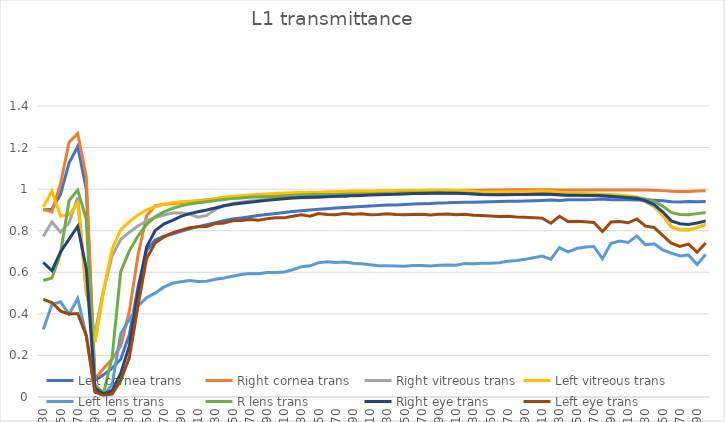
| Category | Left cornea trans | Right cornea trans | Right vitreous trans | Left vitreous trans | Left lens trans | R lens trans | Right eye trans | Left eye trans |
|---|---|---|---|---|---|---|---|---|
| 230.0 | 0.9 | 0.904 | 0.773 | 0.916 | 0.324 | 0.56 | 0.647 | 0.47 |
| 240.0 | 0.903 | 0.891 | 0.842 | 0.989 | 0.444 | 0.573 | 0.608 | 0.454 |
| 250.0 | 0.975 | 1.025 | 0.793 | 0.871 | 0.458 | 0.69 | 0.698 | 0.413 |
| 260.0 | 1.127 | 1.226 | 0.839 | 0.877 | 0.399 | 0.945 | 0.76 | 0.4 |
| 270.0 | 1.205 | 1.268 | 0.961 | 0.932 | 0.474 | 0.995 | 0.822 | 0.402 |
| 280.0 | 0.998 | 1.059 | 0.506 | 0.518 | 0.295 | 0.854 | 0.618 | 0.295 |
| 290.0 | 0.081 | 0.085 | 0.301 | 0.263 | 0.024 | 0.059 | 0.043 | 0.024 |
| 300.0 | 0.106 | 0.137 | 0.512 | 0.509 | 0.008 | 0.019 | 0.015 | 0.008 |
| 310.0 | 0.139 | 0.182 | 0.679 | 0.713 | 0.06 | 0.19 | 0.03 | 0.014 |
| 320.0 | 0.181 | 0.245 | 0.758 | 0.804 | 0.304 | 0.603 | 0.113 | 0.079 |
| 330.0 | 0.3 | 0.411 | 0.793 | 0.843 | 0.373 | 0.703 | 0.245 | 0.19 |
| 340.0 | 0.528 | 0.679 | 0.823 | 0.876 | 0.437 | 0.775 | 0.503 | 0.437 |
| 350.0 | 0.705 | 0.871 | 0.846 | 0.9 | 0.478 | 0.83 | 0.721 | 0.665 |
| 360.0 | 0.755 | 0.919 | 0.864 | 0.915 | 0.5 | 0.867 | 0.8 | 0.741 |
| 370.0 | 0.773 | 0.928 | 0.876 | 0.927 | 0.528 | 0.891 | 0.832 | 0.769 |
| 380.0 | 0.784 | 0.929 | 0.885 | 0.935 | 0.547 | 0.907 | 0.85 | 0.79 |
| 390.0 | 0.798 | 0.936 | 0.885 | 0.94 | 0.555 | 0.92 | 0.869 | 0.803 |
| 400.0 | 0.81 | 0.941 | 0.879 | 0.941 | 0.56 | 0.928 | 0.882 | 0.815 |
| 410.0 | 0.82 | 0.944 | 0.865 | 0.942 | 0.556 | 0.934 | 0.892 | 0.82 |
| 420.0 | 0.829 | 0.949 | 0.874 | 0.946 | 0.557 | 0.94 | 0.9 | 0.82 |
| 430.0 | 0.839 | 0.954 | 0.902 | 0.954 | 0.566 | 0.945 | 0.909 | 0.834 |
| 440.0 | 0.849 | 0.96 | 0.92 | 0.961 | 0.573 | 0.95 | 0.92 | 0.837 |
| 450.0 | 0.856 | 0.964 | 0.931 | 0.965 | 0.581 | 0.954 | 0.927 | 0.847 |
| 460.0 | 0.862 | 0.967 | 0.937 | 0.969 | 0.589 | 0.957 | 0.932 | 0.849 |
| 470.0 | 0.868 | 0.969 | 0.942 | 0.972 | 0.594 | 0.96 | 0.937 | 0.854 |
| 480.0 | 0.873 | 0.971 | 0.946 | 0.974 | 0.594 | 0.962 | 0.942 | 0.851 |
| 490.0 | 0.878 | 0.973 | 0.951 | 0.977 | 0.599 | 0.963 | 0.946 | 0.858 |
| 500.0 | 0.883 | 0.975 | 0.954 | 0.979 | 0.599 | 0.965 | 0.951 | 0.862 |
| 510.0 | 0.888 | 0.977 | 0.956 | 0.981 | 0.601 | 0.967 | 0.954 | 0.862 |
| 520.0 | 0.892 | 0.979 | 0.959 | 0.983 | 0.612 | 0.969 | 0.957 | 0.87 |
| 530.0 | 0.896 | 0.981 | 0.959 | 0.984 | 0.627 | 0.971 | 0.96 | 0.877 |
| 540.0 | 0.9 | 0.983 | 0.958 | 0.985 | 0.631 | 0.974 | 0.961 | 0.869 |
| 550.0 | 0.903 | 0.984 | 0.961 | 0.985 | 0.646 | 0.975 | 0.962 | 0.883 |
| 560.0 | 0.906 | 0.984 | 0.965 | 0.988 | 0.65 | 0.974 | 0.964 | 0.879 |
| 570.0 | 0.909 | 0.986 | 0.965 | 0.988 | 0.647 | 0.975 | 0.965 | 0.877 |
| 580.0 | 0.912 | 0.986 | 0.965 | 0.989 | 0.65 | 0.975 | 0.967 | 0.883 |
| 590.0 | 0.915 | 0.987 | 0.971 | 0.99 | 0.644 | 0.975 | 0.968 | 0.879 |
| 600.0 | 0.917 | 0.988 | 0.974 | 0.991 | 0.641 | 0.976 | 0.97 | 0.882 |
| 610.0 | 0.919 | 0.989 | 0.975 | 0.992 | 0.636 | 0.976 | 0.971 | 0.877 |
| 620.0 | 0.921 | 0.989 | 0.976 | 0.992 | 0.631 | 0.978 | 0.973 | 0.878 |
| 630.0 | 0.924 | 0.99 | 0.978 | 0.993 | 0.632 | 0.979 | 0.975 | 0.882 |
| 640.0 | 0.924 | 0.99 | 0.978 | 0.994 | 0.631 | 0.98 | 0.975 | 0.878 |
| 650.0 | 0.927 | 0.991 | 0.979 | 0.994 | 0.629 | 0.981 | 0.977 | 0.877 |
| 660.0 | 0.929 | 0.992 | 0.98 | 0.995 | 0.632 | 0.981 | 0.979 | 0.878 |
| 670.0 | 0.93 | 0.992 | 0.981 | 0.995 | 0.632 | 0.982 | 0.979 | 0.879 |
| 680.0 | 0.931 | 0.992 | 0.981 | 0.996 | 0.631 | 0.982 | 0.98 | 0.875 |
| 690.0 | 0.934 | 0.993 | 0.982 | 0.996 | 0.633 | 0.982 | 0.981 | 0.879 |
| 700.0 | 0.934 | 0.993 | 0.982 | 0.996 | 0.635 | 0.981 | 0.98 | 0.88 |
| 710.0 | 0.936 | 0.994 | 0.982 | 0.995 | 0.634 | 0.982 | 0.98 | 0.877 |
| 720.0 | 0.937 | 0.994 | 0.981 | 0.993 | 0.643 | 0.98 | 0.979 | 0.88 |
| 730.0 | 0.938 | 0.995 | 0.978 | 0.99 | 0.641 | 0.978 | 0.977 | 0.874 |
| 740.0 | 0.938 | 0.995 | 0.975 | 0.987 | 0.643 | 0.976 | 0.974 | 0.873 |
| 750.0 | 0.939 | 0.995 | 0.975 | 0.987 | 0.644 | 0.975 | 0.973 | 0.871 |
| 760.0 | 0.941 | 0.996 | 0.975 | 0.987 | 0.646 | 0.975 | 0.973 | 0.868 |
| 770.0 | 0.941 | 0.997 | 0.976 | 0.987 | 0.653 | 0.974 | 0.974 | 0.87 |
| 780.0 | 0.942 | 0.997 | 0.977 | 0.988 | 0.657 | 0.974 | 0.974 | 0.866 |
| 790.0 | 0.943 | 0.997 | 0.978 | 0.988 | 0.662 | 0.974 | 0.974 | 0.864 |
| 800.0 | 0.944 | 0.997 | 0.98 | 0.99 | 0.67 | 0.974 | 0.976 | 0.863 |
| 810.0 | 0.945 | 0.997 | 0.981 | 0.991 | 0.678 | 0.974 | 0.976 | 0.86 |
| 820.0 | 0.947 | 0.997 | 0.979 | 0.989 | 0.662 | 0.974 | 0.976 | 0.836 |
| 830.0 | 0.946 | 0.996 | 0.977 | 0.985 | 0.718 | 0.972 | 0.973 | 0.87 |
| 840.0 | 0.949 | 0.996 | 0.974 | 0.982 | 0.698 | 0.971 | 0.971 | 0.844 |
| 850.0 | 0.949 | 0.996 | 0.972 | 0.981 | 0.714 | 0.97 | 0.97 | 0.846 |
| 860.0 | 0.949 | 0.996 | 0.971 | 0.979 | 0.722 | 0.971 | 0.97 | 0.843 |
| 870.0 | 0.95 | 0.996 | 0.97 | 0.978 | 0.724 | 0.97 | 0.969 | 0.84 |
| 880.0 | 0.953 | 0.996 | 0.967 | 0.976 | 0.665 | 0.97 | 0.968 | 0.797 |
| 890.0 | 0.949 | 0.996 | 0.966 | 0.974 | 0.739 | 0.967 | 0.965 | 0.842 |
| 900.0 | 0.949 | 0.996 | 0.964 | 0.972 | 0.75 | 0.964 | 0.962 | 0.845 |
| 910.0 | 0.949 | 0.996 | 0.961 | 0.969 | 0.743 | 0.961 | 0.958 | 0.838 |
| 920.0 | 0.948 | 0.996 | 0.957 | 0.963 | 0.775 | 0.959 | 0.955 | 0.856 |
| 930.0 | 0.949 | 0.996 | 0.94 | 0.946 | 0.732 | 0.953 | 0.944 | 0.822 |
| 940.0 | 0.947 | 0.995 | 0.916 | 0.92 | 0.737 | 0.941 | 0.925 | 0.816 |
| 950.0 | 0.944 | 0.993 | 0.873 | 0.876 | 0.708 | 0.918 | 0.891 | 0.777 |
| 960.0 | 0.939 | 0.99 | 0.819 | 0.82 | 0.693 | 0.888 | 0.847 | 0.74 |
| 970.0 | 0.939 | 0.989 | 0.805 | 0.805 | 0.679 | 0.878 | 0.833 | 0.724 |
| 980.0 | 0.941 | 0.989 | 0.803 | 0.803 | 0.684 | 0.876 | 0.83 | 0.736 |
| 990.0 | 0.939 | 0.991 | 0.815 | 0.815 | 0.637 | 0.882 | 0.837 | 0.697 |
| 1000.0 | 0.941 | 0.992 | 0.831 | 0.831 | 0.686 | 0.888 | 0.847 | 0.741 |